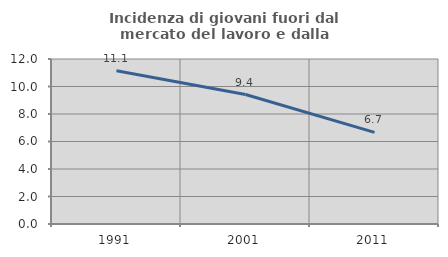
| Category | Incidenza di giovani fuori dal mercato del lavoro e dalla formazione  |
|---|---|
| 1991.0 | 11.143 |
| 2001.0 | 9.414 |
| 2011.0 | 6.667 |